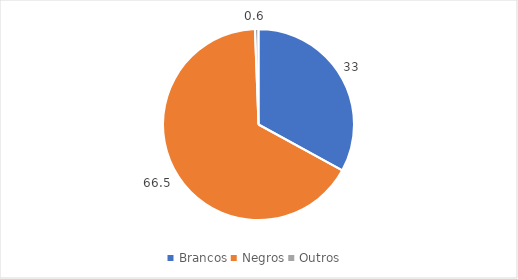
| Category | Series 0 |
|---|---|
| Brancos | 33 |
| Negros | 66.5 |
| Outros  | 0.6 |